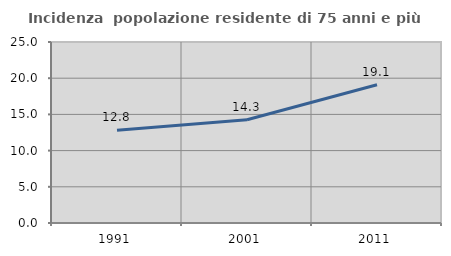
| Category | Incidenza  popolazione residente di 75 anni e più |
|---|---|
| 1991.0 | 12.798 |
| 2001.0 | 14.271 |
| 2011.0 | 19.091 |